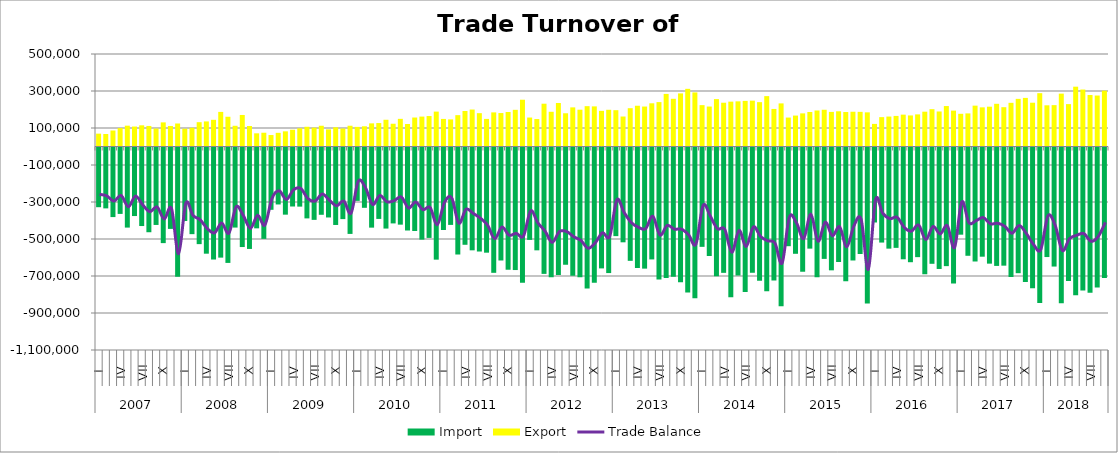
| Category | Import | Export |
|---|---|---|
| 0 | -328137.428 | 69473.835 |
| 1 | -334459.902 | 67469.561 |
| 2 | -381545.727 | 86485.258 |
| 3 | -364407.83 | 99579.043 |
| 4 | -438345.425 | 112612.284 |
| 5 | -375919.942 | 107918.489 |
| 6 | -429942.484 | 114501.191 |
| 7 | -463469.136 | 111126.511 |
| 8 | -424050.769 | 97183.969 |
| 9 | -522267.672 | 130413.835 |
| 10 | -445390.926 | 110997.546 |
| 11 | -704213.005 | 124348.947 |
| 12 | -402575.025 | 96157.037 |
| 13 | -473805.365 | 101214.427 |
| 14 | -527726.957 | 131397.232 |
| 15 | -579390.37 | 135532.592 |
| 16 | -610953.408 | 144223.295 |
| 17 | -600700.531 | 187019.429 |
| 18 | -629238.431 | 160784.767 |
| 19 | -438214.751 | 112046.47 |
| 20 | -543482.238 | 170475.427 |
| 21 | -553710.327 | 110823.513 |
| 22 | -442400.172 | 71226.822 |
| 23 | -499342.768 | 74444.228 |
| 24 | -342172.891 | 61992.595 |
| 25 | -313305.2 | 73882.564 |
| 26 | -368421.542 | 81964.131 |
| 27 | -324331.62 | 90575.384 |
| 28 | -325013.796 | 98333.759 |
| 29 | -388587.943 | 106636.938 |
| 30 | -396599.106 | 102008.498 |
| 31 | -369105.39 | 112226.511 |
| 32 | -383616.972 | 92627.175 |
| 33 | -424156.143 | 103821.906 |
| 34 | -392445.75 | 97243.451 |
| 35 | -472487.714 | 112309.489 |
| 36 | -293895.433 | 106064.492 |
| 37 | -331405.786 | 109307.304 |
| 38 | -438593.88 | 125094.217 |
| 39 | -391466.377 | 126732.826 |
| 40 | -443586.207 | 144566.325 |
| 41 | -415754.856 | 123019.4 |
| 42 | -422418.39 | 149517.049 |
| 43 | -454069.86 | 121491.454 |
| 44 | -456766.108 | 156666.699 |
| 45 | -503426.607 | 161726.515 |
| 46 | -494134.733 | 164687.607 |
| 47 | -611604.197 | 188598.168 |
| 48 | -451309.458 | 149010.644 |
| 49 | -423793.525 | 146578.748 |
| 50 | -583825.022 | 169493.189 |
| 51 | -531280.086 | 191970.173 |
| 52 | -561216.825 | 199783.493 |
| 53 | -567722.238 | 180198.594 |
| 54 | -573950.28 | 149150.663 |
| 55 | -682821.526 | 184407.918 |
| 56 | -616128.006 | 180852.789 |
| 57 | -666126.682 | 186641.23 |
| 58 | -667818.752 | 198251.768 |
| 59 | -736741.388 | 252796.62 |
| 60 | -504795.744 | 156548.304 |
| 61 | -561245.241 | 148452.793 |
| 62 | -688545.632 | 231354.031 |
| 63 | -706187.659 | 187713.44 |
| 64 | -694827.44 | 235062.822 |
| 65 | -639198.689 | 179645.423 |
| 66 | -699314.296 | 211478.747 |
| 67 | -707051.188 | 198935.781 |
| 68 | -768121.772 | 218103.736 |
| 69 | -737103.652 | 216869.809 |
| 70 | -658928.109 | 192707.068 |
| 71 | -684156.84 | 198511.792 |
| 72 | -484510.166 | 196270.253 |
| 73 | -517895.062 | 162100.421 |
| 74 | -618028.057 | 207058.123 |
| 75 | -656766.022 | 220319.968 |
| 76 | -660133.83 | 216011.247 |
| 77 | -610381.872 | 233583.127 |
| 78 | -718870.489 | 240016.286 |
| 79 | -710962.361 | 284268.477 |
| 80 | -704339.98 | 257853.114 |
| 81 | -734189.374 | 287023.64 |
| 82 | -789551.275 | 311739.566 |
| 83 | -820086.931 | 292254.741 |
| 84 | -542427.286 | 223612.854 |
| 85 | -591950.372 | 216056.361 |
| 86 | -701034.248 | 256202.016 |
| 87 | -682942.999 | 236606.206 |
| 88 | -814368.234 | 242506.121 |
| 89 | -697796.037 | 244083.524 |
| 90 | -787009.075 | 246465.522 |
| 91 | -682549.858 | 247769.838 |
| 92 | -726340.963 | 239731.245 |
| 93 | -782290.909 | 272322.182 |
| 94 | -724680.114 | 202926.728 |
| 95 | -862879.859 | 233012.969 |
| 96 | -538891.152 | 156419.793 |
| 97 | -579977.504 | 167210.896 |
| 98 | -676965.059 | 179075.373 |
| 99 | -552058.464 | 186554.958 |
| 100 | -706417.657 | 194612.062 |
| 101 | -607536.095 | 198583.755 |
| 102 | -669370.322 | 187036.287 |
| 103 | -624263.369 | 190362.202 |
| 104 | -728605.63 | 186333.061 |
| 105 | -616128.302 | 187914.12 |
| 106 | -581222.627 | 187288.327 |
| 107 | -848666.858 | 184620.727 |
| 108 | -410772.702 | 122160.969 |
| 109 | -519251.619 | 158749.443 |
| 110 | -552107.01 | 161900.102 |
| 111 | -547894.926 | 165302.85 |
| 112 | -609712.575 | 172239.015 |
| 113 | -625481.307 | 167884.862 |
| 114 | -598068.122 | 173574.954 |
| 115 | -690996.664 | 188142.545 |
| 116 | -634056.88 | 201743.962 |
| 117 | -661956.245 | 189333.815 |
| 118 | -646662.84 | 218689.735 |
| 119 | -740091.479 | 194004.02 |
| 120 | -476633.63 | 176770.495 |
| 121 | -590689.289 | 178910.081 |
| 122 | -621589.906 | 220843.521 |
| 123 | -595661.909 | 211605.86 |
| 124 | -633218.654 | 215234.782 |
| 125 | -645486.277 | 230813.253 |
| 126 | -644134.453 | 212474.806 |
| 127 | -704960.062 | 236122.257 |
| 128 | -684784.163 | 257521.119 |
| 129 | -733096.775 | 262736.792 |
| 130 | -766834.92 | 236697.74 |
| 131 | -845325.921 | 288236.739 |
| 132 | -597547.543 | 222730.176 |
| 133 | -648938.913 | 223674.133 |
| 134 | -847912.618 | 285793.704 |
| 135 | -727406.311 | 229156.774 |
| 136 | -803426.78 | 323345.406 |
| 137 | -778408.173 | 307825.623 |
| 138 | -790737.485 | 278322.686 |
| 139 | -762097.862 | 275578.559 |
| 140 | -711429.294 | 301720.561 |